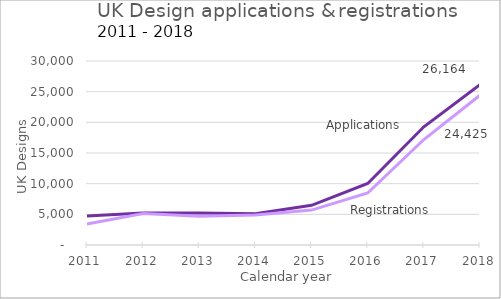
| Category | Applications | Registrations |
|---|---|---|
| 2011.0 | 4730 | 3423 |
| 2012.0 | 5231 | 5144 |
| 2013.0 | 5210 | 4671 |
| 2014.0 | 5084 | 4901 |
| 2015.0 | 6472 | 5690 |
| 2016.0 | 10030 | 8481 |
| 2017.0 | 19269 | 17195 |
| 2018.0 | 26164 | 24425 |